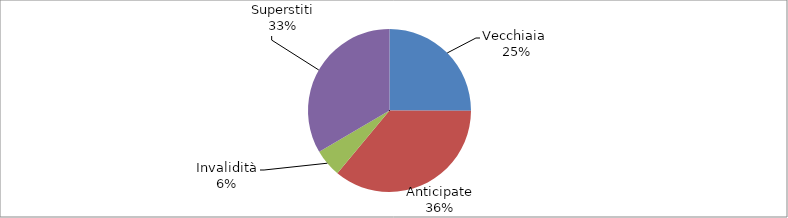
| Category | Series 0 |
|---|---|
| Vecchiaia  | 22165 |
| Anticipate | 31850 |
| Invalidità | 4876 |
| Superstiti | 29586 |